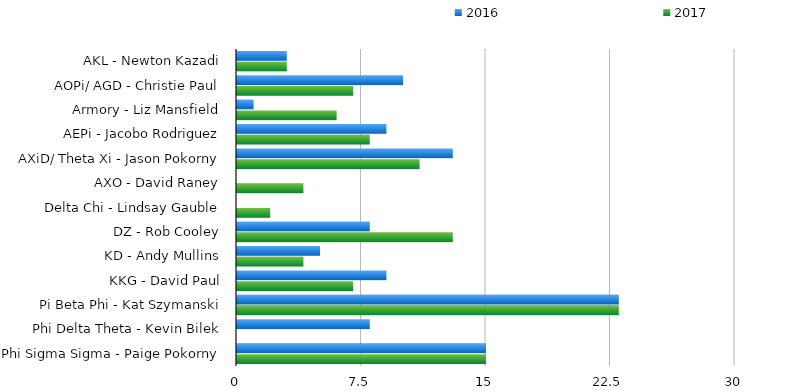
| Category | 2016 | 2017 |
|---|---|---|
| AKL - Newton Kazadi | 3 | 3 |
| AOPi/ AGD - Christie Paul | 10 | 7 |
| Armory - Liz Mansfield | 1 | 6 |
| AEPi - Jacobo Rodriguez | 9 | 8 |
| AXiD/ Theta Xi - Jason Pokorny | 13 | 11 |
| AXO - David Raney | 0 | 4 |
| Delta Chi - Lindsay Gauble | 0 | 2 |
| DZ - Rob Cooley | 8 | 13 |
| KD - Andy Mullins | 5 | 4 |
| KKG - David Paul | 9 | 7 |
| Pi Beta Phi - Kat Szymanski | 23 | 23 |
| Phi Delta Theta - Kevin Bilek | 8 | 0 |
| Phi Sigma Sigma - Paige Pokorny | 15 | 15 |